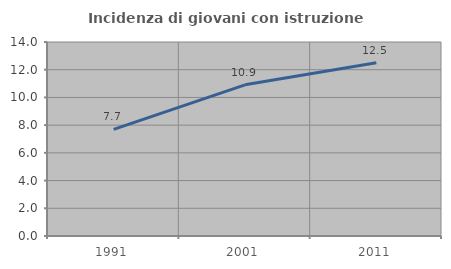
| Category | Incidenza di giovani con istruzione universitaria |
|---|---|
| 1991.0 | 7.692 |
| 2001.0 | 10.909 |
| 2011.0 | 12.5 |